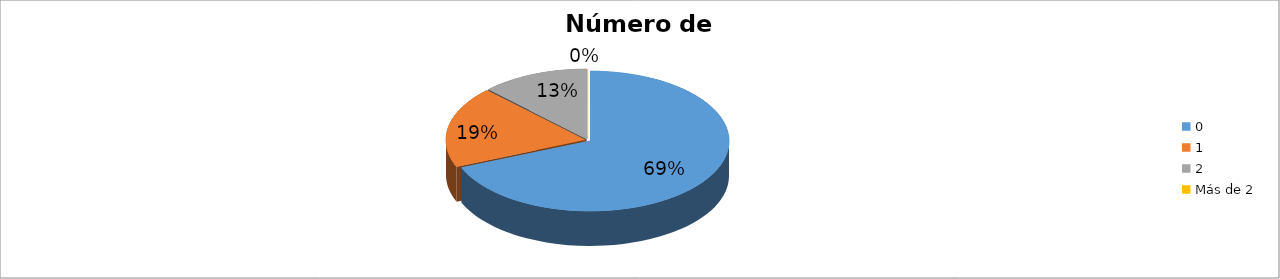
| Category | Series 0 |
|---|---|
| 0 | 0.688 |
| 1 | 0.188 |
| 2 | 0.125 |
| Más de 2 | 0 |